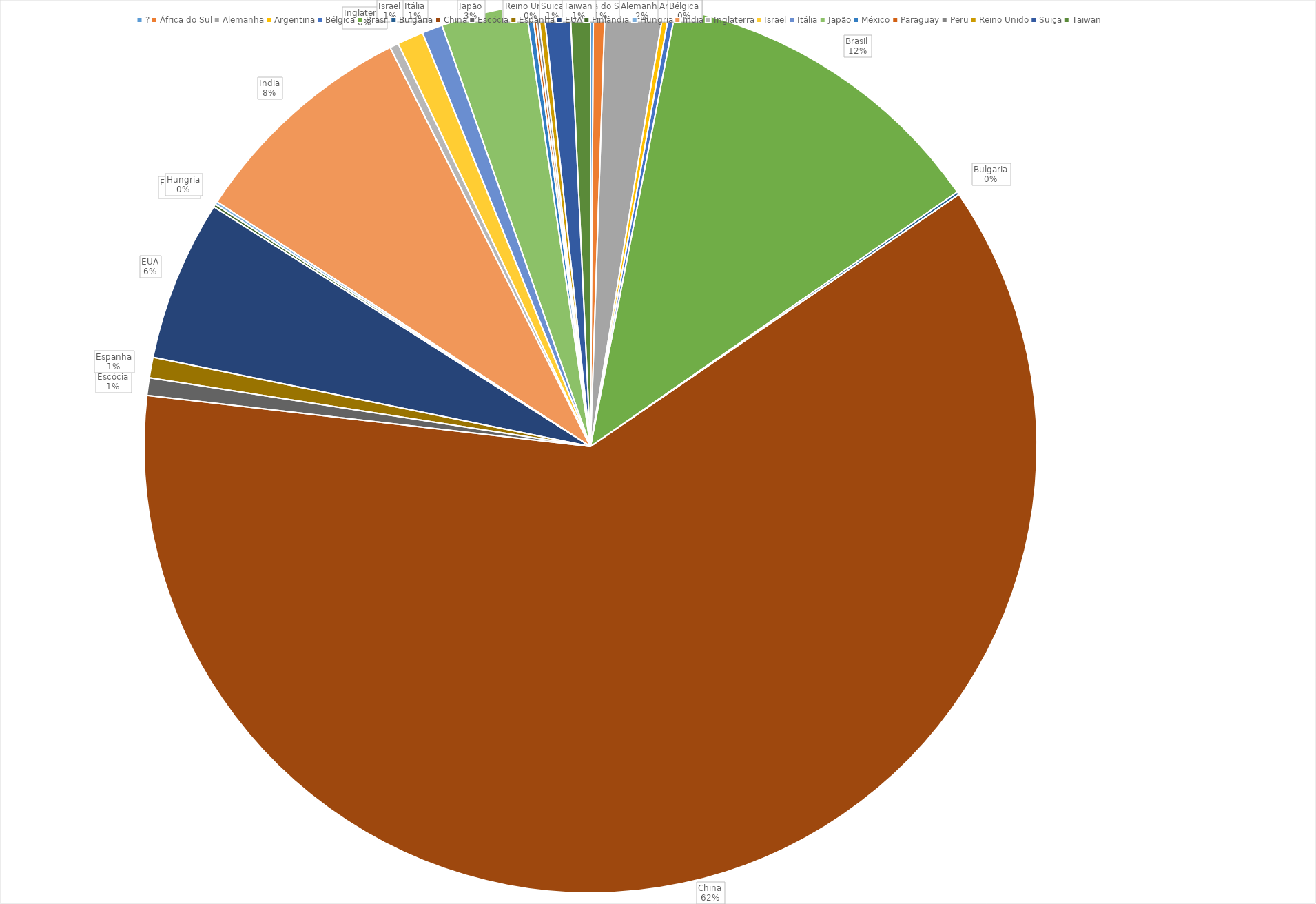
| Category | Series 0 |
|---|---|
| ? | 1 |
| África do Sul | 4 |
| Alemanha | 20 |
| Argentina | 2 |
| Bélgica | 2 |
| Brasil | 116 |
| Bulgaria | 1 |
| China | 580 |
| Escócia | 6 |
| Espanha | 7 |
| EUA | 55 |
| Finlândia | 1 |
| Hungria | 1 |
| India | 79 |
| Inglaterra | 3 |
| Israel | 9 |
| Itália | 7 |
| Japão | 29 |
| México | 2 |
| Paraguay | 1 |
| Peru | 1 |
| Reino Unido | 2 |
| Suiça | 9 |
| Taiwan | 7 |